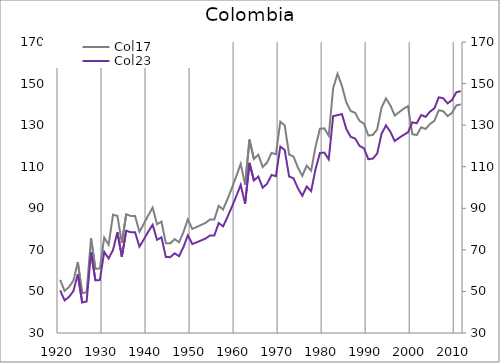
| Category | Col17 |
|---|---|
| 1920.0 | 55.558 |
| 1921.0 | 50.251 |
| 1922.0 | 52.108 |
| 1923.0 | 55.213 |
| 1924.0 | 64.129 |
| 1925.0 | 49.114 |
| 1926.0 | 49.653 |
| 1927.0 | 75.694 |
| 1928.0 | 60.852 |
| 1929.0 | 61.011 |
| 1930.0 | 75.915 |
| 1931.0 | 72.441 |
| 1932.0 | 86.929 |
| 1933.0 | 86.307 |
| 1934.0 | 73.396 |
| 1935.0 | 87.136 |
| 1936.0 | 86.339 |
| 1937.0 | 86.339 |
| 1938.0 | 78.693 |
| 1939.0 | 82.521 |
| 1940.0 | 86.626 |
| 1941.0 | 90.298 |
| 1942.0 | 82.305 |
| 1943.0 | 83.601 |
| 1944.0 | 73.232 |
| 1945.0 | 73.124 |
| 1946.0 | 75.177 |
| 1947.0 | 73.664 |
| 1948.0 | 78.525 |
| 1949.0 | 84.682 |
| 1950.0 | 80.037 |
| 1951.0 | 81.009 |
| 1952.0 | 81.981 |
| 1953.0 | 82.953 |
| 1954.0 | 84.574 |
| 1955.0 | 84.574 |
| 1956.0 | 91.162 |
| 1957.0 | 89.434 |
| 1958.0 | 94.403 |
| 1959.0 | 99.803 |
| 1960.0 | 105.42 |
| 1961.0 | 111.361 |
| 1962.0 | 101.423 |
| 1963.0 | 123.022 |
| 1964.0 | 113.708 |
| 1965.0 | 115.804 |
| 1966.0 | 109.854 |
| 1967.0 | 112.026 |
| 1968.0 | 116.654 |
| 1969.0 | 115.993 |
| 1970.0 | 131.673 |
| 1971.0 | 129.878 |
| 1972.0 | 115.804 |
| 1973.0 | 114.86 |
| 1974.0 | 109.57 |
| 1975.0 | 105.603 |
| 1976.0 | 110.515 |
| 1977.0 | 108.059 |
| 1978.0 | 119.677 |
| 1979.0 | 128.273 |
| 1980.0 | 128.462 |
| 1981.0 | 124.873 |
| 1982.0 | 147.74 |
| 1983.0 | 154.698 |
| 1984.0 | 148.839 |
| 1985.0 | 140.883 |
| 1986.0 | 136.788 |
| 1987.0 | 135.92 |
| 1988.0 | 132.031 |
| 1989.0 | 130.721 |
| 1990.0 | 124.982 |
| 1991.0 | 125.291 |
| 1992.0 | 127.917 |
| 1993.0 | 138.445 |
| 1994.0 | 142.865 |
| 1995.0 | 139.47 |
| 1996.0 | 134.584 |
| 1997.0 | 136.288 |
| 1998.0 | 137.845 |
| 1999.0 | 139.169 |
| 2000.0 | 125.616 |
| 2001.0 | 125.263 |
| 2002.0 | 128.988 |
| 2003.0 | 128.155 |
| 2004.0 | 130.553 |
| 2005.0 | 132.082 |
| 2006.0 | 137.145 |
| 2007.0 | 136.744 |
| 2008.0 | 134.367 |
| 2009.0 | 135.916 |
| 2010.0 | 139.523 |
| 2011.0 | 139.965 |